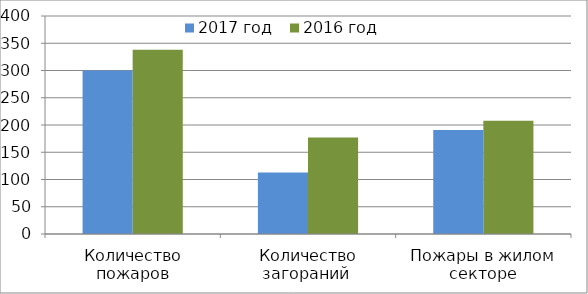
| Category | 2017 год | 2016 год |
|---|---|---|
| Количество пожаров | 300 | 338 |
| Количество загораний  | 113 | 177 |
| Пожары в жилом секторе | 191 | 208 |